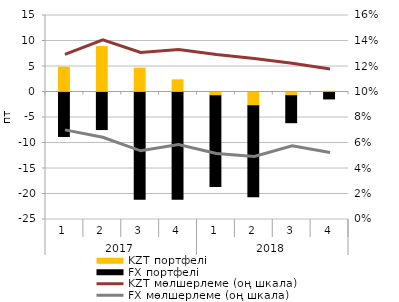
| Category | KZT портфелі | FX портфелі |
|---|---|---|
| 0 | 4.863 | -8.719 |
| 1 | 8.921 | -7.364 |
| 2 | 4.683 | -21.012 |
| 3 | 2.386 | -21.008 |
| 4 | -0.727 | -17.797 |
| 5 | -2.707 | -17.81 |
| 6 | -0.724 | -5.295 |
| 7 | 0.153 | -1.359 |